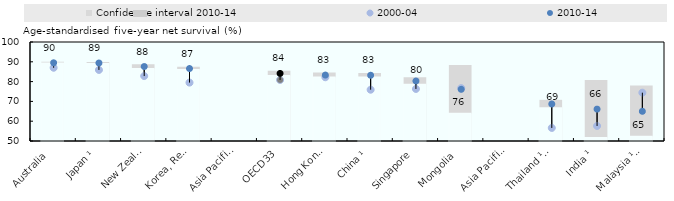
| Category | Confidence interval 2010-14 | Lower band |
|---|---|---|
| Australia  | 90 | 89.1 |
| Japan ¹ | 89.9 | 88.9 |
| New Zealand  | 88.7 | 86.4 |
| Korea, Rep.  | 87.5 | 85.8 |
| Asia Pacific-H | 87.15 | 85.117 |
| OECD33 | 85.479 | 82.791 |
| Hong Kong, China  | 84.6 | 82.1 |
| China ¹ | 84.3 | 82.1 |
| Singapore  | 82.2 | 78.4 |
| Mongolia  | 88.4 | 63.8 |
| Asia Pacific-UM | 77.7 | 66.933 |
| Thailand ¹ ² | 70.8 | 66.6 |
| India ¹ | 80.8 | 51.5 |
| Malaysia ¹ ² | 78 | 52.1 |